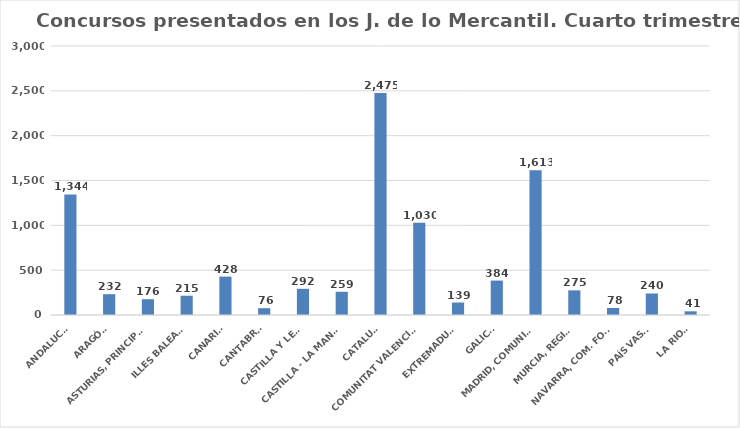
| Category | Series 0 |
|---|---|
| ANDALUCÍA | 1344 |
| ARAGÓN | 232 |
| ASTURIAS, PRINCIPADO | 176 |
| ILLES BALEARS | 215 |
| CANARIAS | 428 |
| CANTABRIA | 76 |
| CASTILLA Y LEÓN | 292 |
| CASTILLA - LA MANCHA | 259 |
| CATALUÑA | 2475 |
| COMUNITAT VALENCIANA | 1030 |
| EXTREMADURA | 139 |
| GALICIA | 384 |
| MADRID, COMUNIDAD | 1613 |
| MURCIA, REGIÓN | 275 |
| NAVARRA, COM. FORAL | 78 |
| PAÍS VASCO | 240 |
| LA RIOJA | 41 |